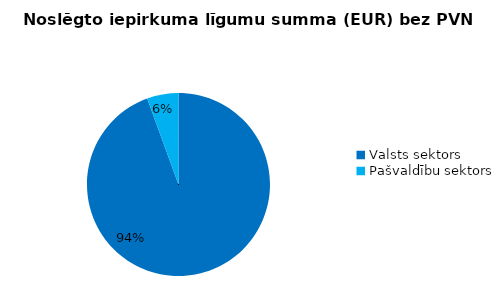
| Category | Noslēgto iepirkuma līgumu summa (EUR) bez PVN |
|---|---|
| Valsts sektors | 97030347 |
| Pašvaldību sektors | 5714371 |